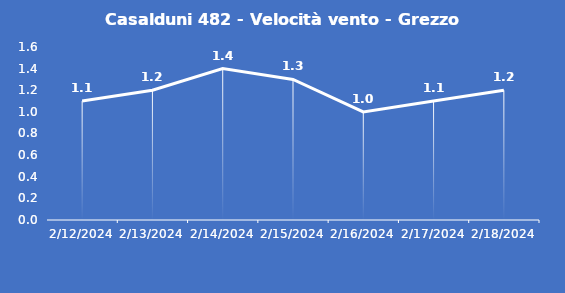
| Category | Casalduni 482 - Velocità vento - Grezzo (m/s) |
|---|---|
| 2/12/24 | 1.1 |
| 2/13/24 | 1.2 |
| 2/14/24 | 1.4 |
| 2/15/24 | 1.3 |
| 2/16/24 | 1 |
| 2/17/24 | 1.1 |
| 2/18/24 | 1.2 |